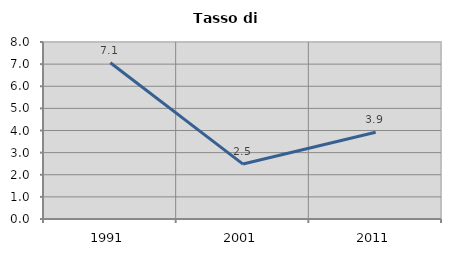
| Category | Tasso di disoccupazione   |
|---|---|
| 1991.0 | 7.063 |
| 2001.0 | 2.482 |
| 2011.0 | 3.922 |